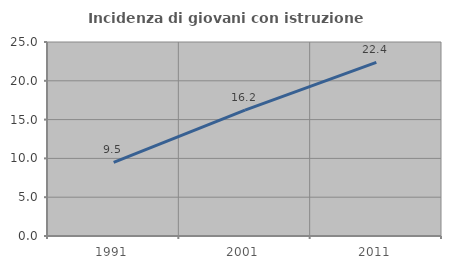
| Category | Incidenza di giovani con istruzione universitaria |
|---|---|
| 1991.0 | 9.487 |
| 2001.0 | 16.216 |
| 2011.0 | 22.364 |